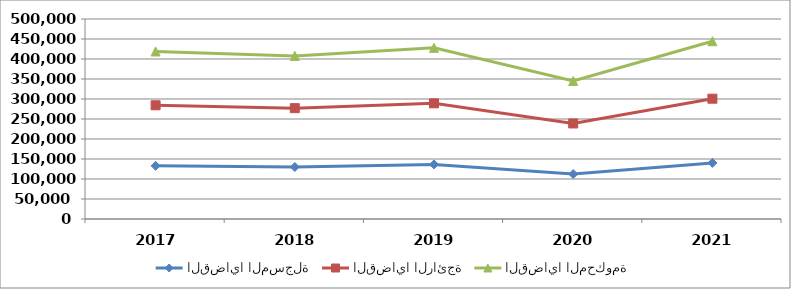
| Category | القضايا المسجلة | القضايا الرائجة | القضايا المحكومة |
|---|---|---|---|
| 2017.0 | 132968 | 151296 | 134596 |
| 2018.0 | 130051 | 147029 | 130576 |
| 2019.0 | 136515 | 152680 | 138733 |
| 2020.0 | 112360 | 126502 | 106246 |
| 2021.0 | 140262 | 160504 | 143744 |